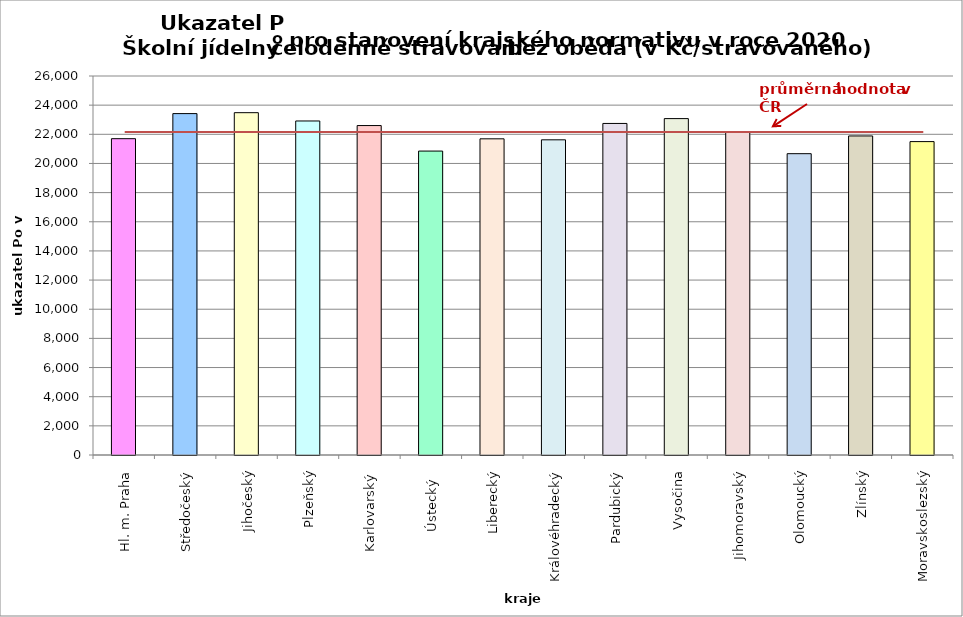
| Category | Series 0 |
|---|---|
| Hl. m. Praha | 21700 |
| Středočeský | 23420 |
| Jihočeský | 23484 |
| Plzeňský | 22915 |
| Karlovarský  | 22600 |
| Ústecký   | 20850 |
| Liberecký | 21690 |
| Královéhradecký | 21622 |
| Pardubický | 22745 |
| Vysočina | 23078 |
| Jihomoravský | 22132 |
| Olomoucký | 20671 |
| Zlínský | 21888 |
| Moravskoslezský | 21500 |